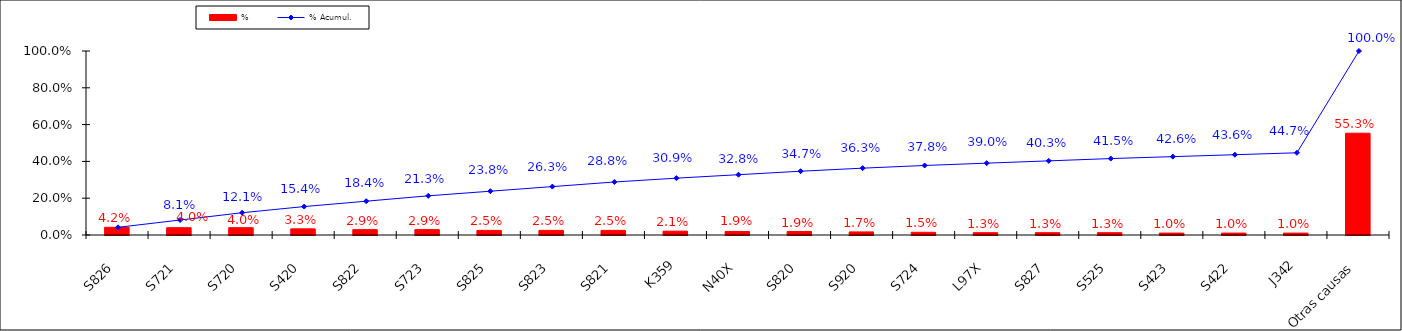
| Category | % |
|---|---|
| S826 | 0.042 |
| S721 | 0.04 |
| S720 | 0.04 |
| S420 | 0.033 |
| S822 | 0.029 |
| S723 | 0.029 |
| S825 | 0.025 |
| S823 | 0.025 |
| S821 | 0.025 |
| K359 | 0.021 |
| N40X | 0.019 |
| S820 | 0.019 |
| S920 | 0.017 |
| S724 | 0.015 |
| L97X | 0.013 |
| S827 | 0.013 |
| S525 | 0.013 |
| S423 | 0.01 |
| S422 | 0.01 |
| J342 | 0.01 |
| Otras causas | 0.553 |